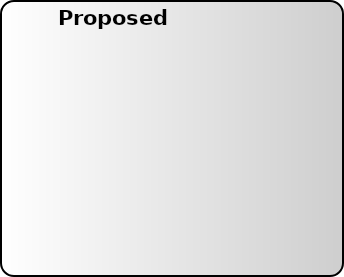
| Category | Series 0 |
|---|---|
| Cash Equivalents | 0 |
| Income (Bonds) | 0 |
| Growth | 0 |
| Int'l Equity | 0 |
| Aggressive Growth/Misc. | 0 |